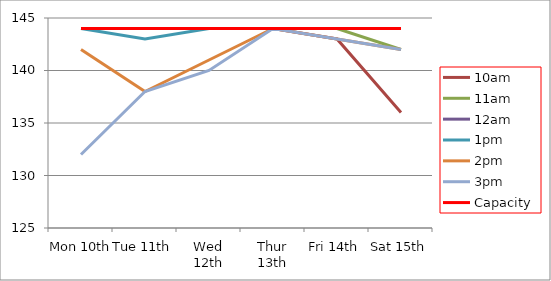
| Category | 9am | 10am | 11am | 12am | 1pm | 2pm | 3pm | 4pm | 5pm | Capacity |
|---|---|---|---|---|---|---|---|---|---|---|
| Mon 10th |  | 144 | 144 | 144 | 144 | 142 | 132 |  |  | 144 |
| Tue 11th |  | 144 | 144 | 144 | 143 | 138 | 138 |  |  | 144 |
| Wed 12th |  | 144 | 144 | 144 | 144 | 141 | 140 |  |  | 144 |
| Thur 13th |  | 144 | 144 | 144 | 144 | 144 | 144 |  |  | 144 |
| Fri 14th |  | 143 | 144 | 144 | 144 | 143 | 143 |  |  | 144 |
| Sat 15th |  | 136 | 142 | 144 | 144 | 142 | 142 |  |  | 144 |